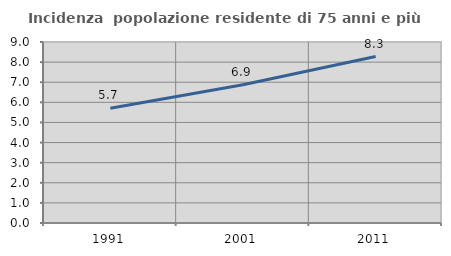
| Category | Incidenza  popolazione residente di 75 anni e più |
|---|---|
| 1991.0 | 5.703 |
| 2001.0 | 6.871 |
| 2011.0 | 8.279 |